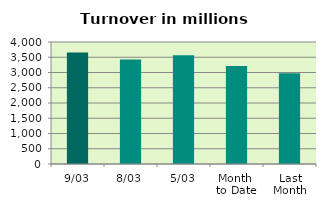
| Category | Series 0 |
|---|---|
| 9/03 | 3652.902 |
| 8/03 | 3424.738 |
| 5/03 | 3567.819 |
| Month 
to Date | 3213.016 |
| Last
Month | 2972.107 |